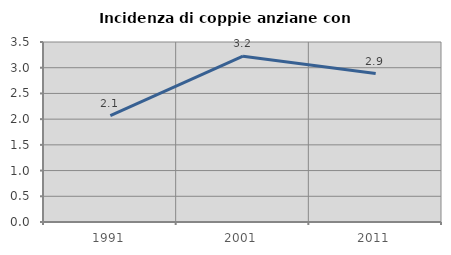
| Category | Incidenza di coppie anziane con figli |
|---|---|
| 1991.0 | 2.069 |
| 2001.0 | 3.223 |
| 2011.0 | 2.886 |